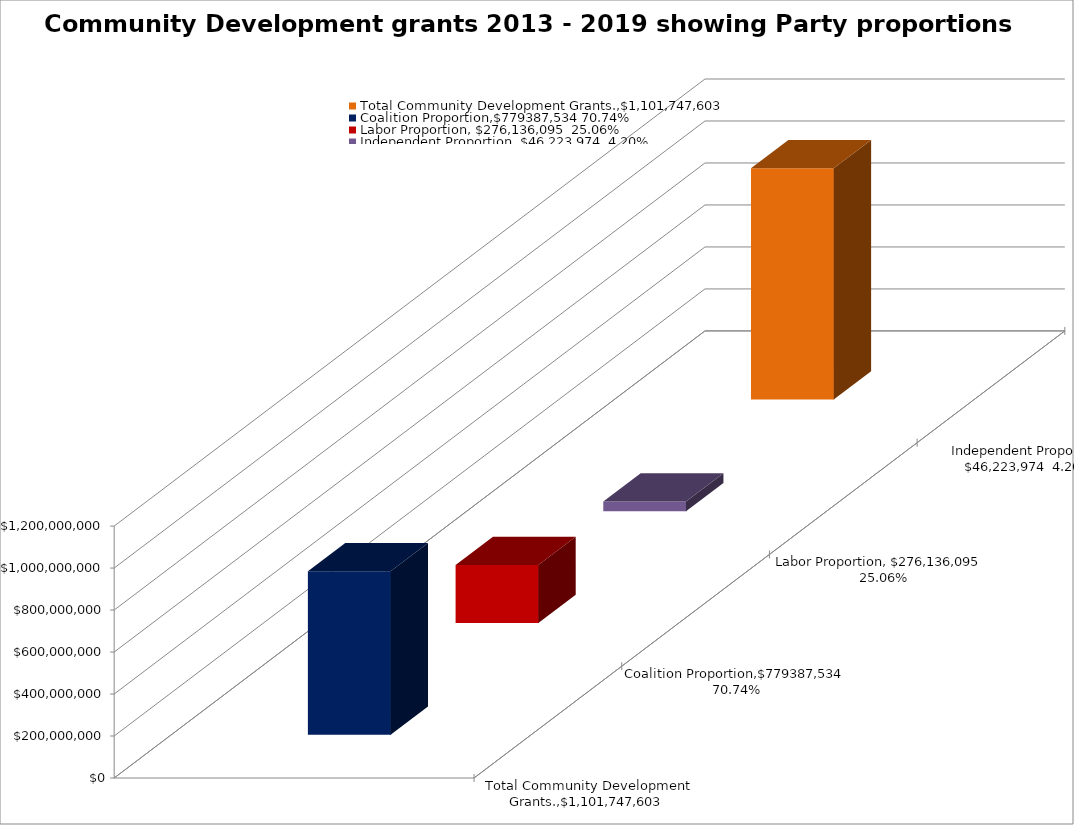
| Category | Total Community Development Grants.,$1,101,747,603 | Coalition Proportion,$779387,534 70.74% | Labor Proportion, $276,136,095  25.06% | Independent Proportion, $46,223,974  4.20% |
|---|---|---|---|---|
| 0 | 1101747603 | 779387534 | 276136095 | 46223974 |